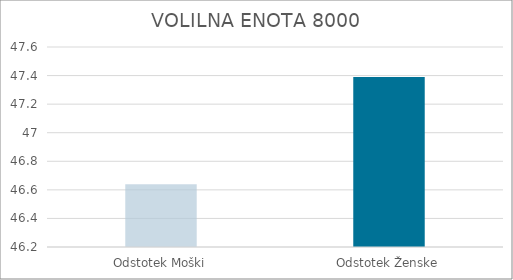
| Category | Series 0 |
|---|---|
| Odstotek Moški | 46.64 |
| Odstotek Ženske | 47.39 |